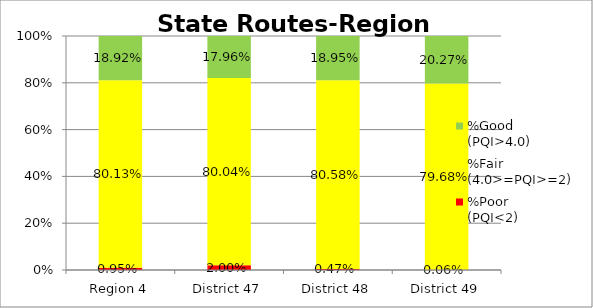
| Category | %Poor
(PQI<2) | %Fair
(4.0>=PQI>=2) | %Good
(PQI>4.0) |
|---|---|---|---|
| Region 4 | 0.009 | 0.801 | 0.189 |
| District 47 | 0.02 | 0.8 | 0.18 |
| District 48 | 0.005 | 0.806 | 0.19 |
| District 49 | 0.001 | 0.797 | 0.203 |